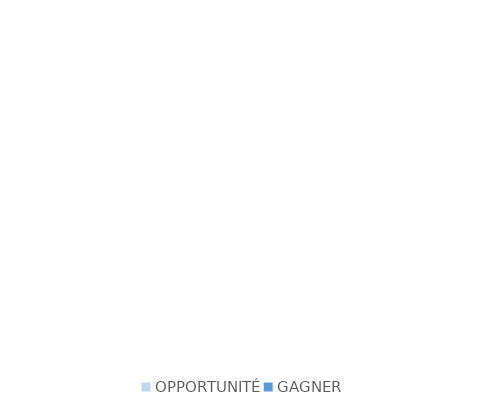
| Category | Series 0 |
|---|---|
| OPPORTUNITÉ | 0 |
| GAGNER | 0 |